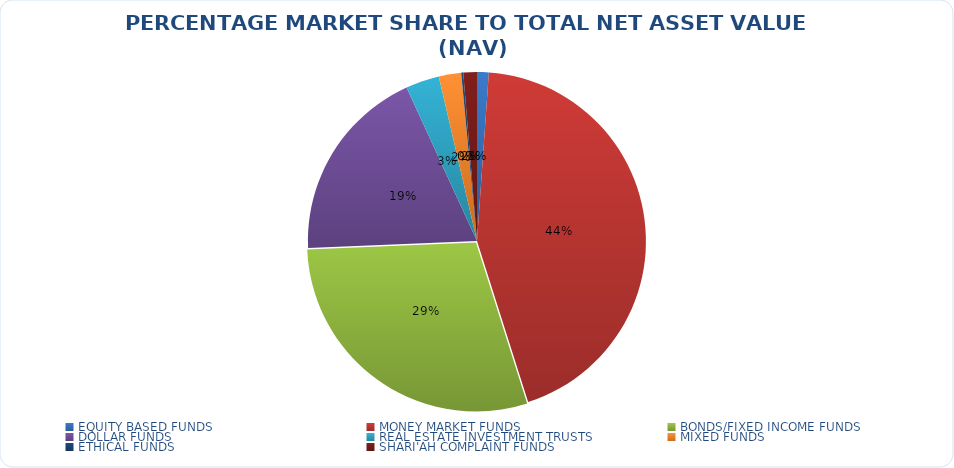
| Category | NET ASSET VALUE |
|---|---|
| EQUITY BASED FUNDS | 15823233457.57 |
| MONEY MARKET FUNDS | 622913275884.208 |
| BONDS/FIXED INCOME FUNDS | 413868142741.87 |
| DOLLAR FUNDS | 266521069013.382 |
| REAL ESTATE INVESTMENT TRUSTS | 45478625907.35 |
| MIXED FUNDS | 30263933632.202 |
| ETHICAL FUNDS | 2767923623.16 |
| SHARI'AH COMPLAINT FUNDS | 18372893373.57 |